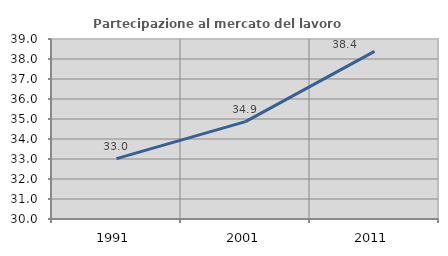
| Category | Partecipazione al mercato del lavoro  femminile |
|---|---|
| 1991.0 | 33.022 |
| 2001.0 | 34.869 |
| 2011.0 | 38.38 |